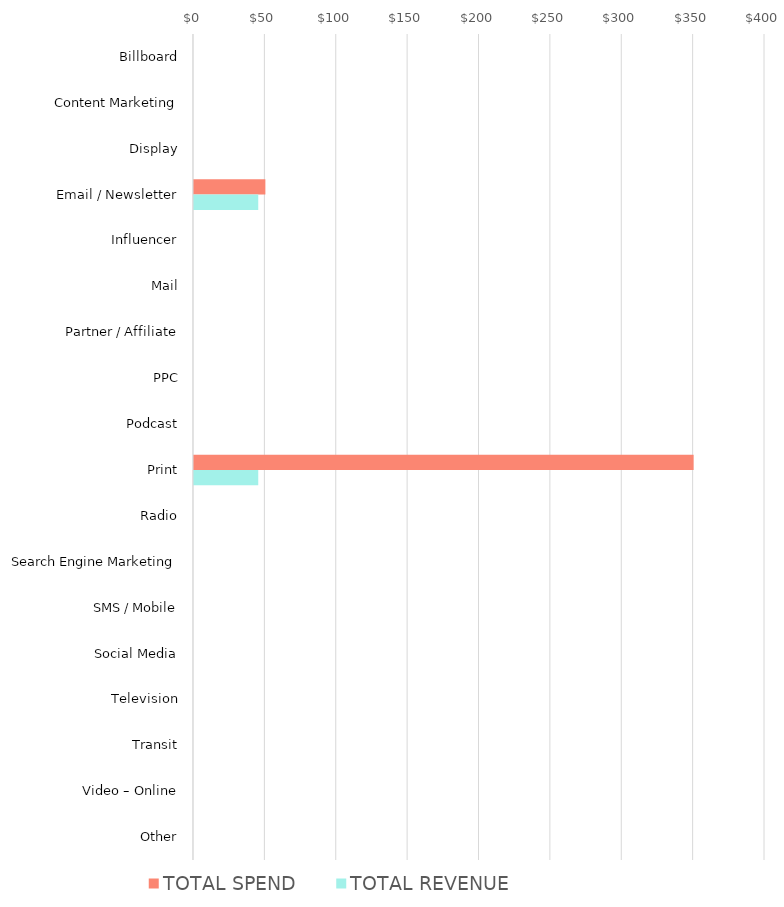
| Category | TOTAL SPEND | TOTAL REVENUE |
|---|---|---|
| Billboard | 0 | 0 |
| Content Marketing | 0 | 0 |
| Display | 0 | 0 |
| Email / Newsletter | 50 | 45 |
| Influencer | 0 | 0 |
| Mail | 0 | 0 |
| Partner / Affiliate | 0 | 0 |
| PPC | 0 | 0 |
| Podcast | 0 | 0 |
| Print | 350 | 45 |
| Radio | 0 | 0 |
| Search Engine Marketing | 0 | 0 |
| SMS / Mobile | 0 | 0 |
| Social Media | 0 | 0 |
| Television | 0 | 0 |
| Transit | 0 | 0 |
| Video – Online | 0 | 0 |
| Other | 0 | 0 |